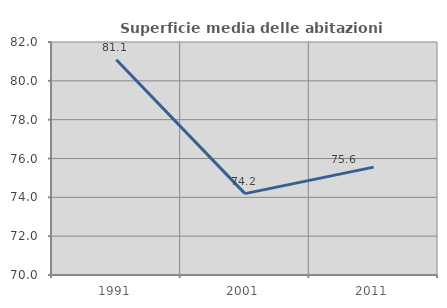
| Category | Superficie media delle abitazioni occupate |
|---|---|
| 1991.0 | 81.084 |
| 2001.0 | 74.191 |
| 2011.0 | 75.555 |